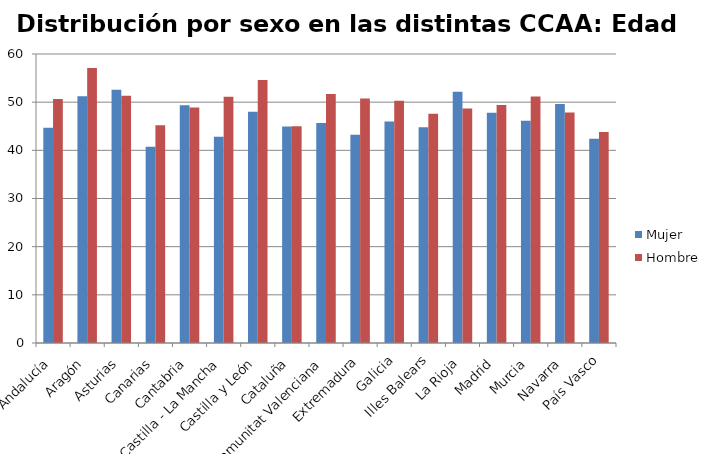
| Category | Mujer | Hombre |
|---|---|---|
| Andalucía | 44.69 | 50.65 |
| Aragón | 51.23 | 57.08 |
| Asturias | 52.57 | 51.32 |
| Canarias | 40.72 | 45.2 |
| Cantabria | 49.35 | 48.9 |
| Castilla - La Mancha | 42.82 | 51.13 |
| Castilla y León | 48 | 54.6 |
| Cataluña | 44.95 | 45.01 |
| Comunitat Valenciana | 45.65 | 51.67 |
| Extremadura | 43.26 | 50.78 |
| Galicia | 45.98 | 50.3 |
| Illes Balears | 44.78 | 47.59 |
| La Rioja | 52.14 | 48.67 |
| Madrid | 47.78 | 49.4 |
| Murcia | 46.14 | 51.2 |
| Navarra | 49.6 | 47.83 |
| País Vasco | 42.4 | 43.82 |